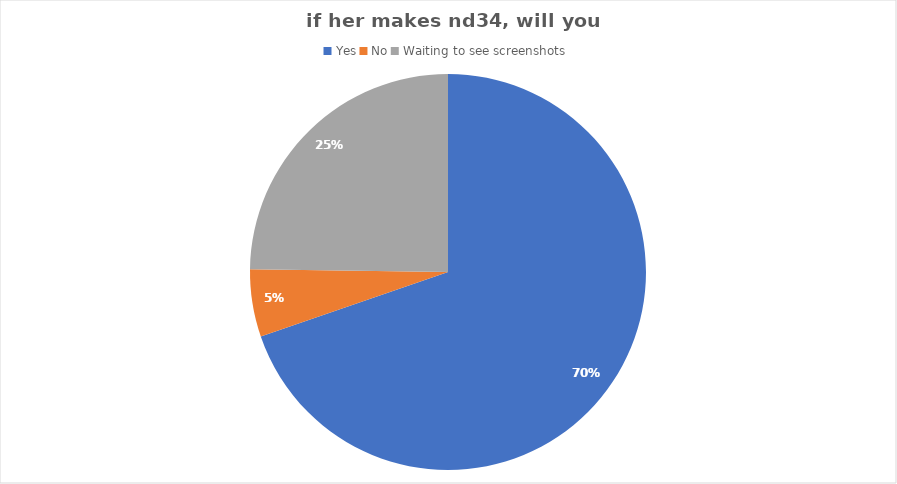
| Category | Series 0 |
|---|---|
| Yes | 76 |
| No | 6 |
| Waiting to see screenshots | 27 |